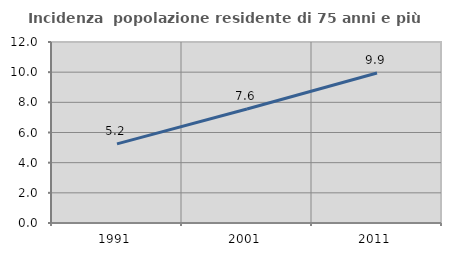
| Category | Incidenza  popolazione residente di 75 anni e più |
|---|---|
| 1991.0 | 5.247 |
| 2001.0 | 7.554 |
| 2011.0 | 9.946 |